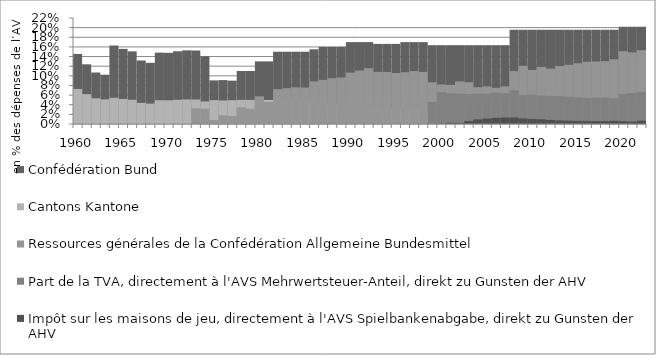
| Category | Confédération | Cantons | Ressources générales de la Confédération | Part de la TVA, directement à l'AVS | Impôt sur les maisons de jeu, directement à l'AVS |
|---|---|---|---|---|---|
| 1960.0 | 0.145 | 0.073 | 0 | 0 | 0 |
| 1961.0 | 0.124 | 0.062 | 0 | 0 | 0 |
| 1962.0 | 0.107 | 0.053 | 0 | 0 | 0 |
| 1963.0 | 0.102 | 0.051 | 0 | 0 | 0 |
| 1964.0 | 0.163 | 0.054 | 0 | 0 | 0 |
| 1965.0 | 0.156 | 0.052 | 0 | 0 | 0 |
| 1966.0 | 0.151 | 0.05 | 0 | 0 | 0 |
| 1967.0 | 0.132 | 0.044 | 0 | 0 | 0 |
| 1968.0 | 0.127 | 0.042 | 0 | 0 | 0 |
| 1969.0 | 0.148 | 0.049 | 0 | 0 | 0 |
| 1970.0 | 0.148 | 0.049 | 0 | 0 | 0 |
| 1971.0 | 0.151 | 0.05 | 0 | 0 | 0 |
| 1972.0 | 0.153 | 0.051 | 0 | 0 | 0 |
| 1973.0 | 0.153 | 0.051 | 0.033 | 0 | 0 |
| 1974.0 | 0.14 | 0.047 | 0.032 | 0 | 0 |
| 1975.0 | 0.091 | 0.05 | 0.008 | 0 | 0 |
| 1976.0 | 0.091 | 0.049 | 0.018 | 0 | 0 |
| 1977.0 | 0.09 | 0.049 | 0.016 | 0 | 0 |
| 1978.0 | 0.11 | 0.05 | 0.035 | 0 | 0 |
| 1979.0 | 0.11 | 0.05 | 0.032 | 0 | 0 |
| 1980.0 | 0.13 | 0.05 | 0.057 | 0 | 0 |
| 1981.0 | 0.13 | 0.05 | 0.046 | 0 | 0 |
| 1982.0 | 0.15 | 0.05 | 0.072 | 0 | 0 |
| 1983.0 | 0.15 | 0.05 | 0.074 | 0 | 0 |
| 1984.0 | 0.15 | 0.05 | 0.076 | 0 | 0 |
| 1985.0 | 0.15 | 0.05 | 0.076 | 0 | 0 |
| 1986.0 | 0.155 | 0.045 | 0.088 | 0 | 0 |
| 1987.0 | 0.16 | 0.04 | 0.092 | 0 | 0 |
| 1988.0 | 0.16 | 0.04 | 0.095 | 0 | 0 |
| 1989.0 | 0.16 | 0.04 | 0.097 | 0 | 0 |
| 1990.0 | 0.17 | 0.03 | 0.107 | 0 | 0 |
| 1991.0 | 0.17 | 0.03 | 0.111 | 0 | 0 |
| 1992.0 | 0.17 | 0.03 | 0.116 | 0 | 0 |
| 1993.0 | 0.166 | 0.03 | 0.108 | 0 | 0 |
| 1994.0 | 0.166 | 0.03 | 0.108 | 0 | 0 |
| 1995.0 | 0.166 | 0.03 | 0.106 | 0 | 0 |
| 1996.0 | 0.17 | 0.03 | 0.107 | 0 | 0 |
| 1997.0 | 0.17 | 0.03 | 0.11 | 0 | 0 |
| 1998.0 | 0.17 | 0.03 | 0.108 | 0 | 0 |
| 1999.0 | 0.164 | 0.036 | 0.087 | 0.046 | 0 |
| 2000.0 | 0.164 | 0.036 | 0.082 | 0.066 | 0.001 |
| 2001.0 | 0.164 | 0.036 | 0.081 | 0.064 | 0.003 |
| 2002.0 | 0.164 | 0.036 | 0.088 | 0.063 | 0.002 |
| 2003.0 | 0.164 | 0.036 | 0.087 | 0.062 | 0.006 |
| 2004.0 | 0.164 | 0.036 | 0.076 | 0.063 | 0.01 |
| 2005.0 | 0.164 | 0.036 | 0.078 | 0.063 | 0.011 |
| 2006.0 | 0.164 | 0.036 | 0.075 | 0.065 | 0.013 |
| 2007.0 | 0.164 | 0.036 | 0.078 | 0.064 | 0.013 |
| 2008.0 | 0.195 | 0 | 0.11 | 0.07 | 0.013 |
| 2009.0 | 0.196 | 0 | 0.121 | 0.06 | 0.012 |
| 2010.0 | 0.195 | 0 | 0.112 | 0.061 | 0.01 |
| 2011.0 | 0.196 | 0 | 0.118 | 0.059 | 0.01 |
| 2012.0 | 0.196 | 0 | 0.115 | 0.058 | 0.008 |
| 2013.0 | 0.196 | 0 | 0.12 | 0.058 | 0.008 |
| 2014.0 | 0.195 | 0 | 0.123 | 0.057 | 0.007 |
| 2015.0 | 0.195 | 0 | 0.126 | 0.055 | 0.007 |
| 2016.0 | 0.195 | 0 | 0.129 | 0.054 | 0.006 |
| 2017.0 | 0.195 | 0 | 0.13 | 0.055 | 0.006 |
| 2018.0 | 0.196 | 0 | 0.13 | 0.055 | 0.006 |
| 2019.0 | 0.195 | 0 | 0.134 | 0.053 | 0.007 |
| 2020.0 | 0.202 | 0 | 0.151 | 0.062 | 0.006 |
| 2021.0 | 0.202 | 0 | 0.149 | 0.065 | 0.005 |
| 2022.0 | 0.202 | 0 | 0.153 | 0.067 | 0.007 |